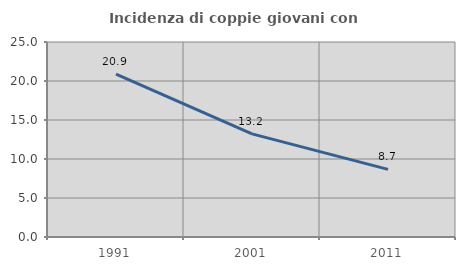
| Category | Incidenza di coppie giovani con figli |
|---|---|
| 1991.0 | 20.89 |
| 2001.0 | 13.225 |
| 2011.0 | 8.674 |